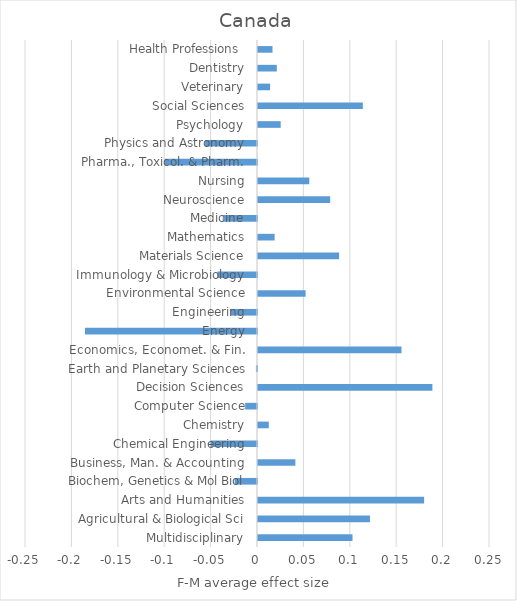
| Category | F-M average effect size |
|---|---|
| Multidisciplinary | 0.102 |
| Agricultural & Biological Sci | 0.121 |
| Arts and Humanities | 0.179 |
| Biochem, Genetics & Mol Biol | -0.024 |
| Business, Man. & Accounting | 0.04 |
| Chemical Engineering | -0.05 |
| Chemistry | 0.012 |
| Computer Science | -0.013 |
| Decision Sciences | 0.188 |
| Earth and Planetary Sciences | -0.001 |
| Economics, Economet. & Fin. | 0.155 |
| Energy | -0.185 |
| Engineering | -0.028 |
| Environmental Science | 0.051 |
| Immunology & Microbiology | -0.043 |
| Materials Science | 0.087 |
| Mathematics | 0.018 |
| Medicine | -0.037 |
| Neuroscience | 0.078 |
| Nursing | 0.055 |
| Pharma., Toxicol. & Pharm. | -0.099 |
| Physics and Astronomy | -0.056 |
| Psychology | 0.024 |
| Social Sciences | 0.113 |
| Veterinary | 0.013 |
| Dentistry | 0.02 |
| Health Professions  | 0.016 |